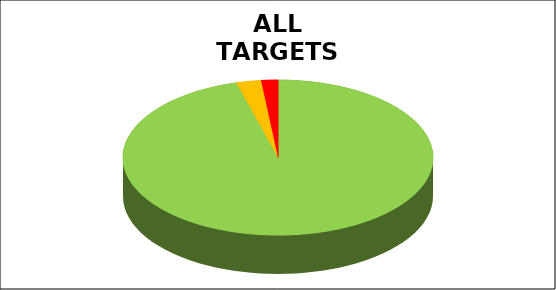
| Category | Series 0 |
|---|---|
| Green | 0.957 |
| Amber | 0.026 |
| Red | 0.017 |